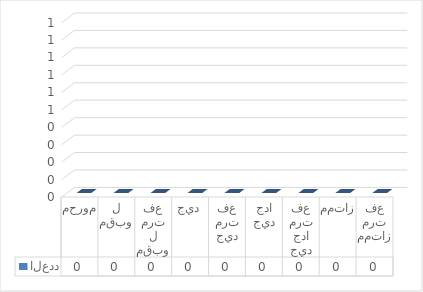
| Category | العدد |
|---|---|
| ممتاز مرتفع | 0 |
| ممتاز  | 0 |
| جيد جدا مرتفع | 0 |
| جيد جدا | 0 |
| جيد مرتفع | 0 |
| جيد | 0 |
| مقبول مرتفع | 0 |
| مقبول | 0 |
| محروم | 0 |